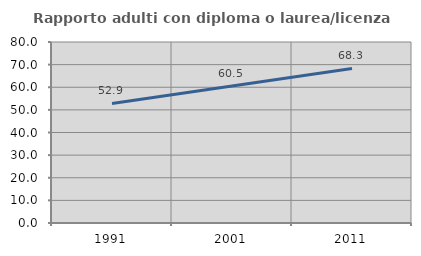
| Category | Rapporto adulti con diploma o laurea/licenza media  |
|---|---|
| 1991.0 | 52.852 |
| 2001.0 | 60.544 |
| 2011.0 | 68.294 |